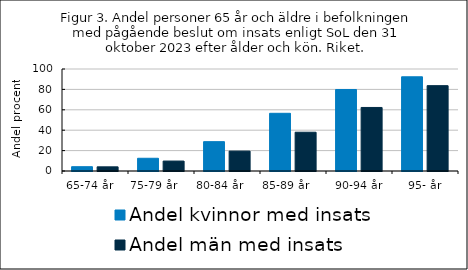
| Category | Andel kvinnor med insats | Andel män med insats |
|---|---|---|
| 65-74 år    | 4.214 | 4.089 |
| 75-79 år       | 12.476 | 9.745 |
| 80-84 år      | 28.764 | 19.512 |
| 85-89 år        | 56.563 | 38.018 |
| 90-94 år | 79.904 | 62.293 |
| 95- år | 92.371 | 83.672 |